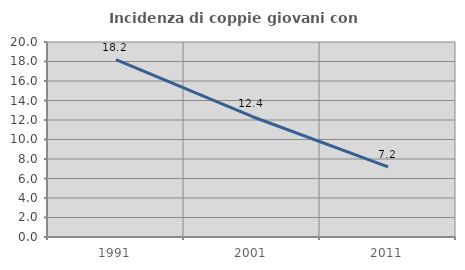
| Category | Incidenza di coppie giovani con figli |
|---|---|
| 1991.0 | 18.202 |
| 2001.0 | 12.362 |
| 2011.0 | 7.191 |